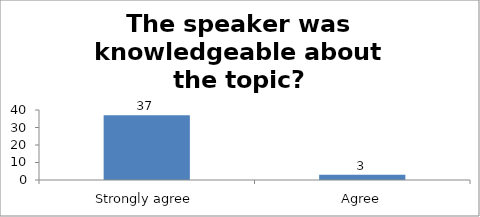
| Category | The speaker was knowledgeable about the topic? |
|---|---|
| Strongly agree | 37 |
| Agree | 3 |